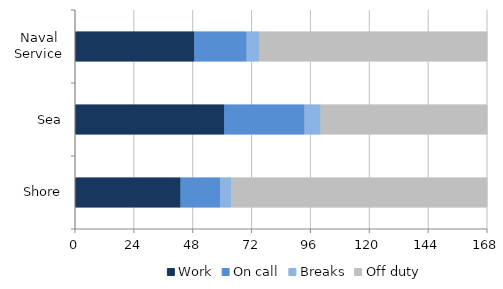
| Category | Work | On call | Breaks | Off duty |
|---|---|---|---|---|
| Naval Service | 48.666 | 21.331 | 5.176 | 92.795 |
| Sea | 60.881 | 32.693 | 6.536 | 67.884 |
| Shore | 43.031 | 16.091 | 4.548 | 104.286 |